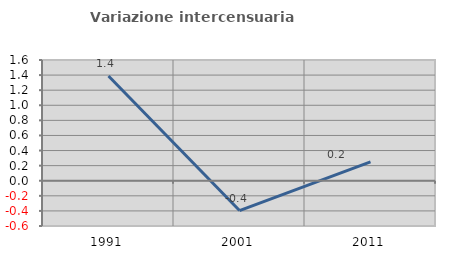
| Category | Variazione intercensuaria annua |
|---|---|
| 1991.0 | 1.387 |
| 2001.0 | -0.395 |
| 2011.0 | 0.249 |